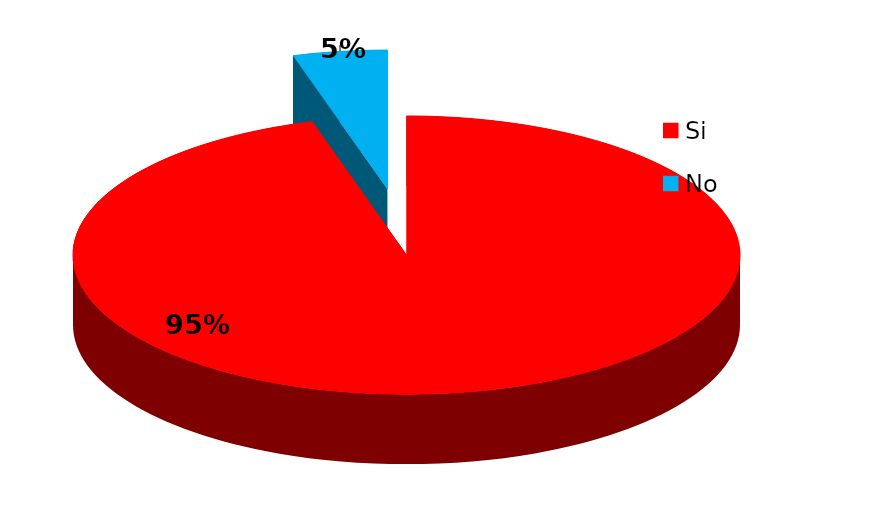
| Category | Series 0 |
|---|---|
| Si | 188 |
| No | 9 |